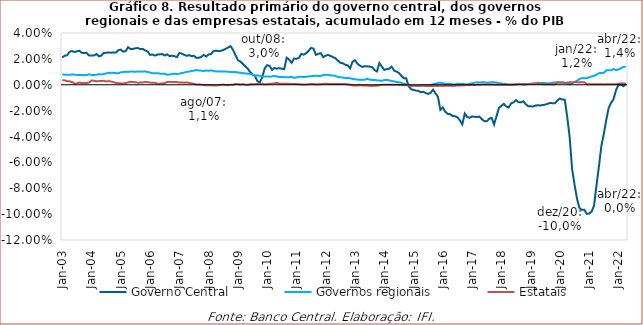
| Category | Governo Central | Governos regionais | Estatais |
|---|---|---|---|
| 2003-01-01 | 0.021 | 0.008 | 0.003 |
| 2003-02-01 | 0.022 | 0.008 | 0.003 |
| 2003-03-01 | 0.023 | 0.008 | 0.003 |
| 2003-04-01 | 0.025 | 0.008 | 0.003 |
| 2003-05-01 | 0.026 | 0.008 | 0.002 |
| 2003-06-01 | 0.025 | 0.008 | 0.001 |
| 2003-07-01 | 0.026 | 0.007 | 0.001 |
| 2003-08-01 | 0.026 | 0.008 | 0.002 |
| 2003-09-01 | 0.025 | 0.008 | 0.001 |
| 2003-10-01 | 0.025 | 0.007 | 0.001 |
| 2003-11-01 | 0.025 | 0.008 | 0.001 |
| 2003-12-01 | 0.023 | 0.008 | 0.002 |
| 2004-01-01 | 0.023 | 0.008 | 0.003 |
| 2004-02-01 | 0.023 | 0.008 | 0.003 |
| 2004-03-01 | 0.024 | 0.008 | 0.003 |
| 2004-04-01 | 0.022 | 0.008 | 0.003 |
| 2004-05-01 | 0.022 | 0.008 | 0.003 |
| 2004-06-01 | 0.025 | 0.008 | 0.003 |
| 2004-07-01 | 0.025 | 0.009 | 0.003 |
| 2004-08-01 | 0.025 | 0.009 | 0.003 |
| 2004-09-01 | 0.025 | 0.009 | 0.002 |
| 2004-10-01 | 0.025 | 0.009 | 0.002 |
| 2004-11-01 | 0.025 | 0.009 | 0.001 |
| 2004-12-01 | 0.027 | 0.009 | 0.001 |
| 2005-01-01 | 0.027 | 0.01 | 0.001 |
| 2005-02-01 | 0.026 | 0.01 | 0.001 |
| 2005-03-01 | 0.026 | 0.01 | 0.001 |
| 2005-04-01 | 0.029 | 0.01 | 0.002 |
| 2005-05-01 | 0.028 | 0.01 | 0.002 |
| 2005-06-01 | 0.028 | 0.01 | 0.002 |
| 2005-07-01 | 0.028 | 0.01 | 0.002 |
| 2005-08-01 | 0.028 | 0.01 | 0.002 |
| 2005-09-01 | 0.028 | 0.01 | 0.002 |
| 2005-10-01 | 0.028 | 0.01 | 0.002 |
| 2005-11-01 | 0.027 | 0.01 | 0.002 |
| 2005-12-01 | 0.026 | 0.01 | 0.002 |
| 2006-01-01 | 0.023 | 0.009 | 0.002 |
| 2006-02-01 | 0.023 | 0.009 | 0.002 |
| 2006-03-01 | 0.023 | 0.009 | 0.002 |
| 2006-04-01 | 0.023 | 0.009 | 0.001 |
| 2006-05-01 | 0.024 | 0.009 | 0.001 |
| 2006-06-01 | 0.024 | 0.008 | 0.001 |
| 2006-07-01 | 0.023 | 0.009 | 0.001 |
| 2006-08-01 | 0.024 | 0.008 | 0.002 |
| 2006-09-01 | 0.022 | 0.008 | 0.002 |
| 2006-10-01 | 0.022 | 0.008 | 0.002 |
| 2006-11-01 | 0.022 | 0.009 | 0.002 |
| 2006-12-01 | 0.021 | 0.008 | 0.002 |
| 2007-01-01 | 0.025 | 0.009 | 0.002 |
| 2007-02-01 | 0.024 | 0.009 | 0.002 |
| 2007-03-01 | 0.023 | 0.009 | 0.002 |
| 2007-04-01 | 0.022 | 0.01 | 0.002 |
| 2007-05-01 | 0.023 | 0.01 | 0.001 |
| 2007-06-01 | 0.022 | 0.011 | 0.001 |
| 2007-07-01 | 0.022 | 0.011 | 0.001 |
| 2007-08-01 | 0.021 | 0.011 | 0 |
| 2007-09-01 | 0.021 | 0.011 | 0 |
| 2007-10-01 | 0.021 | 0.011 | 0 |
| 2007-11-01 | 0.023 | 0.011 | 0 |
| 2007-12-01 | 0.022 | 0.011 | 0 |
| 2008-01-01 | 0.023 | 0.011 | 0 |
| 2008-02-01 | 0.024 | 0.011 | 0 |
| 2008-03-01 | 0.026 | 0.011 | -0.001 |
| 2008-04-01 | 0.026 | 0.01 | -0.001 |
| 2008-05-01 | 0.026 | 0.01 | 0 |
| 2008-06-01 | 0.026 | 0.01 | 0 |
| 2008-07-01 | 0.027 | 0.01 | 0 |
| 2008-08-01 | 0.028 | 0.01 | 0 |
| 2008-09-01 | 0.029 | 0.01 | 0 |
| 2008-10-01 | 0.03 | 0.01 | 0 |
| 2008-11-01 | 0.027 | 0.01 | 0 |
| 2008-12-01 | 0.023 | 0.01 | 0.001 |
| 2009-01-01 | 0.019 | 0.009 | 0 |
| 2009-02-01 | 0.018 | 0.009 | 0 |
| 2009-03-01 | 0.016 | 0.009 | 0 |
| 2009-04-01 | 0.014 | 0.009 | 0 |
| 2009-05-01 | 0.013 | 0.009 | 0 |
| 2009-06-01 | 0.01 | 0.008 | 0 |
| 2009-07-01 | 0.008 | 0.008 | 0 |
| 2009-08-01 | 0.007 | 0.007 | 0 |
| 2009-09-01 | 0.003 | 0.007 | 0.001 |
| 2009-10-01 | 0.002 | 0.007 | 0.001 |
| 2009-11-01 | 0.006 | 0.006 | 0.001 |
| 2009-12-01 | 0.013 | 0.006 | 0 |
| 2010-01-01 | 0.015 | 0.006 | 0 |
| 2010-02-01 | 0.015 | 0.006 | 0.001 |
| 2010-03-01 | 0.012 | 0.006 | 0.001 |
| 2010-04-01 | 0.013 | 0.007 | 0.001 |
| 2010-05-01 | 0.012 | 0.006 | 0.001 |
| 2010-06-01 | 0.013 | 0.006 | 0.001 |
| 2010-07-01 | 0.012 | 0.006 | 0.001 |
| 2010-08-01 | 0.012 | 0.006 | 0.001 |
| 2010-09-01 | 0.021 | 0.006 | 0.001 |
| 2010-10-01 | 0.02 | 0.006 | 0.001 |
| 2010-11-01 | 0.017 | 0.006 | 0.001 |
| 2010-12-01 | 0.02 | 0.005 | 0.001 |
| 2011-01-01 | 0.02 | 0.006 | 0 |
| 2011-02-01 | 0.021 | 0.006 | 0 |
| 2011-03-01 | 0.024 | 0.006 | 0 |
| 2011-04-01 | 0.023 | 0.006 | 0 |
| 2011-05-01 | 0.024 | 0.006 | 0 |
| 2011-06-01 | 0.026 | 0.006 | 0 |
| 2011-07-01 | 0.029 | 0.007 | 0.001 |
| 2011-08-01 | 0.028 | 0.007 | 0.001 |
| 2011-09-01 | 0.023 | 0.007 | 0 |
| 2011-10-01 | 0.024 | 0.007 | 0 |
| 2011-11-01 | 0.024 | 0.007 | 0 |
| 2011-12-01 | 0.021 | 0.008 | 0.001 |
| 2012-01-01 | 0.023 | 0.008 | 0.001 |
| 2012-02-01 | 0.023 | 0.008 | 0.001 |
| 2012-03-01 | 0.022 | 0.007 | 0.001 |
| 2012-04-01 | 0.021 | 0.007 | 0.001 |
| 2012-05-01 | 0.021 | 0.007 | 0 |
| 2012-06-01 | 0.019 | 0.006 | 0.001 |
| 2012-07-01 | 0.017 | 0.006 | 0 |
| 2012-08-01 | 0.017 | 0.006 | 0.001 |
| 2012-09-01 | 0.015 | 0.005 | 0 |
| 2012-10-01 | 0.015 | 0.005 | 0 |
| 2012-11-01 | 0.013 | 0.005 | 0 |
| 2012-12-01 | 0.018 | 0.004 | -0.001 |
| 2013-01-01 | 0.019 | 0.004 | -0.001 |
| 2013-02-01 | 0.016 | 0.004 | -0.001 |
| 2013-03-01 | 0.015 | 0.004 | 0 |
| 2013-04-01 | 0.014 | 0.004 | 0 |
| 2013-05-01 | 0.014 | 0.004 | -0.001 |
| 2013-06-01 | 0.014 | 0.005 | -0.001 |
| 2013-07-01 | 0.014 | 0.004 | -0.001 |
| 2013-08-01 | 0.014 | 0.004 | -0.001 |
| 2013-09-01 | 0.011 | 0.004 | -0.001 |
| 2013-10-01 | 0.01 | 0.003 | -0.001 |
| 2013-11-01 | 0.017 | 0.003 | 0 |
| 2013-12-01 | 0.014 | 0.003 | 0 |
| 2014-01-01 | 0.011 | 0.004 | 0 |
| 2014-02-01 | 0.012 | 0.004 | 0 |
| 2014-03-01 | 0.012 | 0.003 | 0 |
| 2014-04-01 | 0.014 | 0.003 | 0 |
| 2014-05-01 | 0.011 | 0.003 | 0 |
| 2014-06-01 | 0.01 | 0.002 | 0 |
| 2014-07-01 | 0.009 | 0.002 | 0 |
| 2014-08-01 | 0.007 | 0.002 | 0 |
| 2014-09-01 | 0.005 | 0.001 | 0 |
| 2014-10-01 | 0.005 | 0 | 0 |
| 2014-11-01 | -0.001 | 0 | 0 |
| 2014-12-01 | -0.004 | -0.001 | -0.001 |
| 2015-01-01 | -0.004 | -0.001 | -0.001 |
| 2015-02-01 | -0.005 | -0.001 | -0.001 |
| 2015-03-01 | -0.005 | -0.001 | -0.001 |
| 2015-04-01 | -0.006 | -0.001 | -0.001 |
| 2015-05-01 | -0.005 | 0 | -0.001 |
| 2015-06-01 | -0.006 | 0 | -0.001 |
| 2015-07-01 | -0.007 | -0.001 | -0.001 |
| 2015-08-01 | -0.006 | 0 | -0.001 |
| 2015-09-01 | -0.004 | 0 | -0.001 |
| 2015-10-01 | -0.007 | 0.001 | -0.001 |
| 2015-11-01 | -0.009 | 0.001 | -0.001 |
| 2015-12-01 | -0.019 | 0.002 | -0.001 |
| 2016-01-01 | -0.018 | 0.001 | -0.001 |
| 2016-02-01 | -0.021 | 0.001 | -0.001 |
| 2016-03-01 | -0.023 | 0.001 | -0.001 |
| 2016-04-01 | -0.023 | 0.001 | -0.001 |
| 2016-05-01 | -0.024 | 0 | -0.001 |
| 2016-06-01 | -0.024 | 0 | -0.001 |
| 2016-07-01 | -0.025 | 0.001 | -0.001 |
| 2016-08-01 | -0.028 | 0.001 | -0.001 |
| 2016-09-01 | -0.031 | 0.001 | 0 |
| 2016-10-01 | -0.022 | 0 | 0 |
| 2016-11-01 | -0.025 | 0 | 0 |
| 2016-12-01 | -0.025 | 0.001 | 0 |
| 2017-01-01 | -0.024 | 0.001 | 0 |
| 2017-02-01 | -0.025 | 0.002 | 0 |
| 2017-03-01 | -0.025 | 0.002 | 0 |
| 2017-04-01 | -0.025 | 0.002 | 0 |
| 2017-05-01 | -0.027 | 0.002 | 0 |
| 2017-06-01 | -0.028 | 0.002 | 0 |
| 2017-07-01 | -0.028 | 0.002 | 0 |
| 2017-08-01 | -0.026 | 0.002 | 0 |
| 2017-09-01 | -0.026 | 0.002 | 0 |
| 2017-10-01 | -0.031 | 0.002 | 0 |
| 2017-11-01 | -0.024 | 0.002 | 0 |
| 2017-12-01 | -0.018 | 0.001 | 0 |
| 2018-01-01 | -0.016 | 0.001 | 0 |
| 2018-02-01 | -0.015 | 0.001 | 0 |
| 2018-03-01 | -0.017 | 0.001 | 0 |
| 2018-04-01 | -0.018 | 0 | 0 |
| 2018-05-01 | -0.014 | 0 | 0 |
| 2018-06-01 | -0.014 | 0 | 0 |
| 2018-07-01 | -0.012 | 0 | 0 |
| 2018-08-01 | -0.013 | 0.001 | 0 |
| 2018-09-01 | -0.014 | 0.001 | 0 |
| 2018-10-01 | -0.013 | 0 | 0.001 |
| 2018-11-01 | -0.015 | 0 | 0 |
| 2018-12-01 | -0.017 | 0 | 0.001 |
| 2019-01-01 | -0.017 | 0.001 | 0.001 |
| 2019-02-01 | -0.017 | 0.001 | 0.001 |
| 2019-03-01 | -0.016 | 0.001 | 0.001 |
| 2019-04-01 | -0.016 | 0.002 | 0.001 |
| 2019-05-01 | -0.016 | 0.001 | 0.001 |
| 2019-06-01 | -0.016 | 0.001 | 0 |
| 2019-07-01 | -0.015 | 0.001 | 0 |
| 2019-08-01 | -0.015 | 0.001 | 0 |
| 2019-09-01 | -0.014 | 0.001 | 0 |
| 2019-10-01 | -0.014 | 0.002 | 0 |
| 2019-11-01 | -0.014 | 0.002 | 0 |
| 2019-12-01 | -0.012 | 0.002 | 0.002 |
| 2020-01-01 | -0.011 | 0.002 | 0.002 |
| 2020-02-01 | -0.011 | 0.002 | 0.002 |
| 2020-03-01 | -0.012 | 0.001 | 0.002 |
| 2020-04-01 | -0.025 | 0.001 | 0.002 |
| 2020-05-01 | -0.04 | 0 | 0.002 |
| 2020-06-01 | -0.065 | 0.001 | 0.002 |
| 2020-07-01 | -0.077 | 0.002 | 0.002 |
| 2020-08-01 | -0.088 | 0.003 | 0.002 |
| 2020-09-01 | -0.095 | 0.004 | 0.002 |
| 2020-10-01 | -0.097 | 0.005 | 0.002 |
| 2020-11-01 | -0.097 | 0.005 | 0.002 |
| 2020-12-01 | -0.1 | 0.005 | 0 |
| 2021-01-01 | -0.1 | 0.006 | 0 |
| 2021-02-01 | -0.098 | 0.006 | 0 |
| 2021-03-01 | -0.093 | 0.007 | 0 |
| 2021-04-01 | -0.078 | 0.008 | 0 |
| 2021-05-01 | -0.063 | 0.009 | 0 |
| 2021-06-01 | -0.047 | 0.009 | 0 |
| 2021-07-01 | -0.038 | 0.009 | 0 |
| 2021-08-01 | -0.027 | 0.011 | 0 |
| 2021-09-01 | -0.018 | 0.011 | 0 |
| 2021-10-01 | -0.014 | 0.011 | 0 |
| 2021-11-01 | -0.011 | 0.012 | 0 |
| 2021-12-01 | -0.004 | 0.011 | 0 |
| 2022-01-01 | 0 | 0.012 | 0.001 |
| 2022-02-01 | 0 | 0.013 | 0.001 |
| 2022-03-01 | -0.001 | 0.014 | 0.001 |
| 2022-04-01 | 0 | 0.014 | 0.001 |